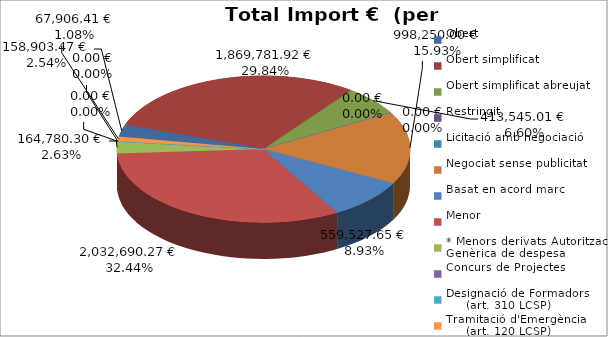
| Category | Total preu
(amb IVA) |
|---|---|
| Obert | 158903.47 |
| Obert simplificat | 1869781.92 |
| Obert simplificat abreujat | 413545.01 |
| Restringit | 0 |
| Licitació amb negociació | 0 |
| Negociat sense publicitat | 998250 |
| Basat en acord marc | 559527.65 |
| Menor | 2032690.27 |
| * Menors derivats Autorització Genèrica de despesa | 164780.3 |
| Concurs de Projectes | 0 |
| Designació de Formadors
     (art. 310 LCSP) | 0 |
| Tramitació d'Emergència
     (art. 120 LCSP) | 67906.41 |